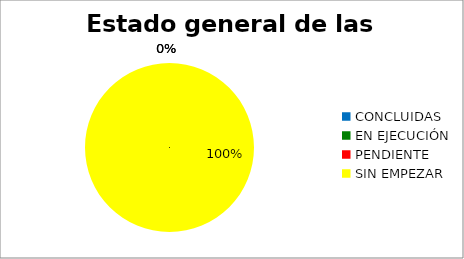
| Category | Series 0 |
|---|---|
| CONCLUIDAS | 0 |
| EN EJECUCIÓN | 0 |
| PENDIENTE | 0 |
| SIN EMPEZAR | 27 |